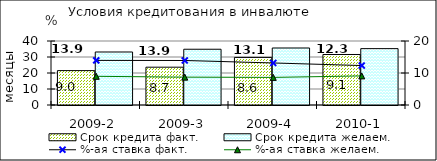
| Category | Срок кредита факт.  | Срок кредита желаем. |
|---|---|---|
| 2009-2 | 21.5 | 33.13 |
| 2009-3 | 23.63 | 34.85 |
| 2009-4 | 29.73 | 35.63 |
| 2010-1 | 31.57 | 35.23 |